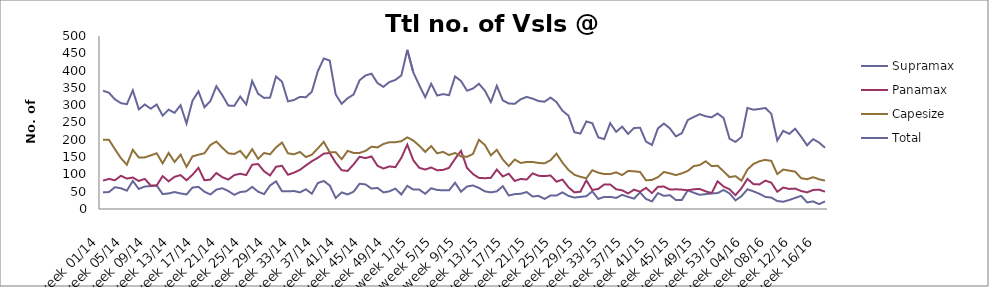
| Category | Supramax | Panamax | Capesize | Total |
|---|---|---|---|---|
| week 01/14 | 48 | 82 | 200 | 342 |
| week 02/14 | 49 | 87 | 200 | 336 |
| week 03/14 | 63 | 83 | 173 | 317 |
| week 04/14 | 60 | 96 | 147 | 306 |
| week 05/14 | 53 | 88 | 128 | 303 |
| week 06/14 | 81 | 91 | 171 | 343 |
| week 07/14 | 58 | 81 | 149 | 288 |
| week 08/14 | 65 | 87 | 149 | 302 |
| week 09/14 | 66 | 68 | 155 | 290 |
| week 10/14 | 68 | 68 | 161 | 302 |
| week 11/14 | 43 | 95 | 132 | 270 |
| week 12/14 | 45 | 80 | 162 | 287 |
| week 13/14 | 49 | 93 | 136 | 278 |
| week 14/14 | 45 | 98 | 157 | 300 |
| week 15/14 | 42 | 83 | 122 | 247 |
| week 16/14 | 62 | 99 | 152 | 313 |
| week 17/14 | 64 | 119 | 157 | 340 |
| week 18/14 | 50 | 83 | 161 | 294 |
| week 19/14 | 42 | 85 | 185 | 312 |
| week 20/14 | 56 | 104 | 195 | 355 |
| week 21/14 | 60 | 92 | 177 | 329 |
| week 22/14 | 52 | 85 | 161 | 299 |
| week 23/14 | 41 | 98 | 159 | 298 |
| week 24/14 | 49 | 102 | 168 | 325 |
| week 25/14 | 51 | 98 | 147 | 302 |
| week 26/14 | 64 | 128 | 173 | 370 |
| week 27/14 | 50 | 130 | 145 | 333 |
| week 28/14 | 43 | 109 | 162 | 321 |
| week 29/14 | 68 | 97 | 158 | 322 |
| week 30/14 | 80 | 122 | 178 | 383 |
| week 31/14 | 51 | 125 | 192 | 368 |
| week 32/14 | 51 | 99 | 161 | 311 |
| week 33/14 | 52 | 105 | 158 | 315 |
| week 34/14 | 48 | 113 | 165 | 324 |
| week 35/14 | 57 | 126 | 150 | 323 |
| week 36/14 | 44 | 138 | 157 | 339 |
| week 37/14 | 75 | 148 | 175 | 398 |
| week 38/14 | 81 | 160 | 194 | 435 |
| week 39/14 | 68 | 162 | 164 | 429 |
| week 40/14 | 32 | 134 | 164 | 331 |
| week 41/14 | 48 | 112 | 144 | 304 |
| week 42/14 | 42 | 110 | 168 | 320 |
| week 43/14 | 50 | 129 | 162 | 331 |
| week 44/14 | 73 | 151 | 162 | 372 |
| week 45/14 | 71 | 147 | 168 | 386 |
| week 46/14 | 59 | 152 | 180 | 391 |
| week 47/14 | 61 | 125 | 178 | 364 |
| week 48/14 | 48 | 117 | 188 | 353 |
| week 49/14 | 51 | 123 | 193 | 367 |
| week 50/14 | 59 | 121 | 193 | 373 |
| week 51/14 | 42 | 148 | 196 | 386 |
| week 52/14 | 67 | 186 | 207 | 460 |
| week 1/15 | 56 | 141 | 198 | 395 |
| week 2/15 | 56 | 119 | 183 | 358 |
| week 3/15 | 44 | 114 | 165 | 323 |
| week 4/15 | 60 | 120 | 182 | 362 |
| week 5/15 | 55 | 112 | 161 | 328 |
| week 6/15 | 54 | 113 | 165 | 332 |
| week 7/15 | 54 | 119 | 156 | 329 |
| week 8/15 | 76 | 145 | 162 | 383 |
| week 9/15 | 50 | 168 | 152 | 370 |
| week 10/15 | 65 | 119 | 151 | 342 |
| week 11/15 | 68 | 101 | 159 | 348 |
| week 12/15 | 61 | 90 | 200 | 362 |
| week 13/15 | 51 | 89 | 185 | 342 |
| week 14/15 | 48 | 90 | 155 | 309 |
| week 15/15 | 51 | 114 | 171 | 356 |
| week 16/15 | 66 | 94 | 143 | 314 |
| week 17/15 | 39 | 102 | 124 | 305 |
| week 18/15 | 43 | 81 | 143 | 304 |
| week 19/15 | 44 | 87 | 133 | 317 |
| week 20/15 | 49 | 85 | 136 | 324 |
| week 21/15 | 36 | 103 | 136 | 319 |
| week 22/15 | 38 | 96 | 133 | 312 |
| week 23/15 | 29 | 95 | 132 | 310 |
| week 24/15 | 39 | 97 | 141 | 322 |
| week 25/15 | 39 | 79 | 160 | 309 |
| week 26/15 | 48 | 85 | 134 | 284 |
| week 27/15 | 38 | 63 | 113 | 270 |
| week 28/15 | 33 | 48 | 99 | 222 |
| week 29/15 | 35 | 50 | 93 | 218 |
| week 30/15 | 37 | 83 | 89 | 253 |
| week 31/15 | 51 | 55 | 112 | 248 |
| week 32/15 | 29 | 58 | 105 | 207 |
| week 33/15 | 35 | 71 | 101 | 202 |
| week 34/15 | 35 | 71 | 101 | 248 |
| week 35/15 | 32 | 57 | 106 | 223 |
| week 36/15 | 41 | 54 | 98 | 238 |
| week 37/15 | 35 | 45 | 110 | 217 |
| week 38/15 | 30 | 56 | 109 | 234 |
| week 39/15 | 48 | 50 | 107 | 235 |
| week 40/15 | 29 | 61 | 83 | 195 |
| week 41/15 | 22 | 46 | 84 | 185 |
| week 42/15 | 46 | 64 | 92 | 233 |
| week 43/15 | 38 | 65 | 107 | 247 |
| week 44/15 | 40 | 56 | 103 | 233 |
| week 45/15 | 26 | 57 | 98 | 210 |
| week 46/15 | 26 | 56 | 103 | 219 |
| week 47/15 | 54 | 54 | 110 | 257 |
| week 48/15 | 47 | 57 | 124 | 266 |
| week 49/15 | 41 | 58 | 127 | 274 |
| week 50/15 | 43 | 51 | 138 | 268 |
| week 51/15 | 45 | 46 | 124 | 265 |
| week 52/15 | 46 | 80 | 125 | 276 |
| week 53/15 | 55 | 65 | 109 | 263 |
| week 01/16 | 45 | 57 | 92 | 203 |
| week 02/16 | 25 | 40 | 95 | 194 |
| week 03/16 | 37 | 60 | 82 | 208 |
| week 04/16 | 57 | 87 | 114 | 292 |
| week 05/16 | 51 | 72 | 130 | 287 |
| week 06/16 | 44 | 71 | 138 | 289 |
| week 07/16 | 35 | 82 | 142 | 292 |
| week 08/16 | 33 | 76 | 139 | 275 |
| week 09/16 | 23 | 50 | 101 | 198 |
| week 10/16 | 21 | 62 | 114 | 226 |
| week 11/16 | 26 | 58 | 111 | 217 |
| week 12/16 | 32 | 59 | 108 | 232 |
| week 13/16 | 38 | 52 | 89 | 209 |
| week 14/16 | 19 | 48 | 86 | 184 |
| week 15/16 | 22 | 55 | 92 | 202 |
| week 16/16 | 14 | 56 | 86 | 192 |
| week 17/16 | 22 | 50 | 82 | 177 |